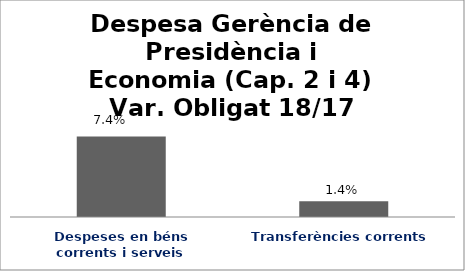
| Category | Series 0 |
|---|---|
| Despeses en béns corrents i serveis | 0.074 |
| Transferències corrents | 0.014 |